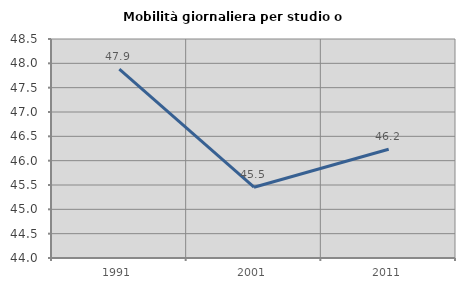
| Category | Mobilità giornaliera per studio o lavoro |
|---|---|
| 1991.0 | 47.883 |
| 2001.0 | 45.455 |
| 2011.0 | 46.235 |